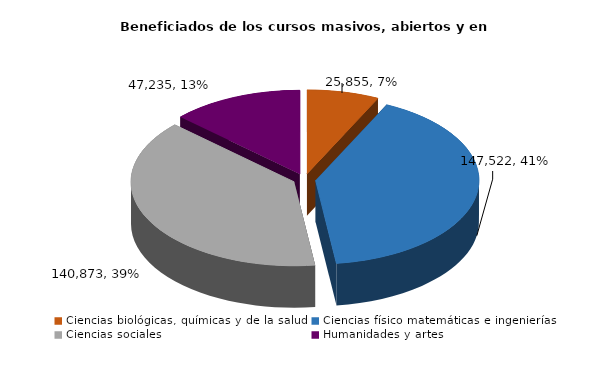
| Category | Series 0 |
|---|---|
| Ciencias biológicas, químicas y de la salud | 25855 |
| Ciencias físico matemáticas e ingenierías | 147522 |
| Ciencias sociales | 140873 |
| Humanidades y artes | 47235 |